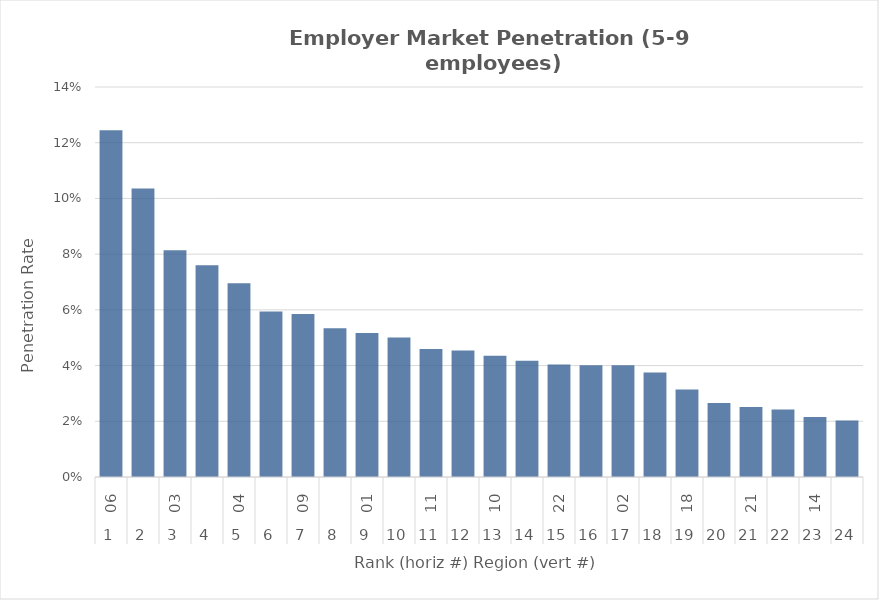
| Category | Rate |
|---|---|
| 0 | 0.124 |
| 1 | 0.104 |
| 2 | 0.081 |
| 3 | 0.076 |
| 4 | 0.07 |
| 5 | 0.059 |
| 6 | 0.059 |
| 7 | 0.053 |
| 8 | 0.052 |
| 9 | 0.05 |
| 10 | 0.046 |
| 11 | 0.045 |
| 12 | 0.043 |
| 13 | 0.042 |
| 14 | 0.04 |
| 15 | 0.04 |
| 16 | 0.04 |
| 17 | 0.038 |
| 18 | 0.031 |
| 19 | 0.027 |
| 20 | 0.025 |
| 21 | 0.024 |
| 22 | 0.022 |
| 23 | 0.02 |